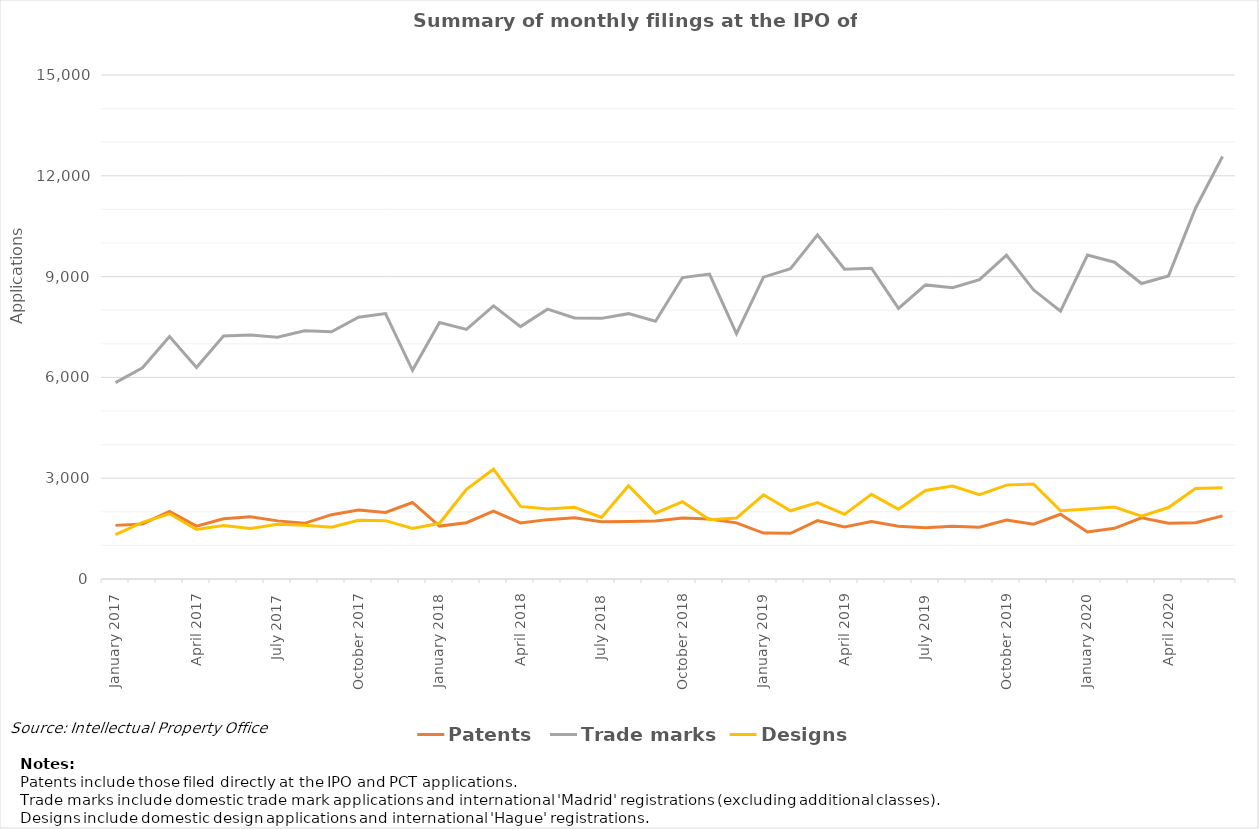
| Category | Patents | Trade marks | Designs |
|---|---|---|---|
| January 2017 | 1596 | 5843 | 1318 |
| February 2017 | 1640 | 6288 | 1687 |
| March 2017 | 2011 | 7214 | 1940 |
| April 2017 | 1573 | 6297 | 1474 |
| May 2017 | 1790 | 7234 | 1592 |
| June 2017 | 1853 | 7263 | 1502 |
| July 2017 | 1730 | 7197 | 1627 |
| August 2017 | 1657 | 7389 | 1600 |
| September 2017 | 1915 | 7359 | 1544 |
| October 2017 | 2055 | 7792 | 1745 |
| November 2017 | 1983 | 7901 | 1736 |
| December 2017 | 2277 | 6211 | 1507 |
| January 2018 | 1575 | 7634 | 1658 |
| February 2018 | 1676 | 7428 | 2672 |
| March 2018 | 2022 | 8127 | 3267 |
| April 2018 | 1670 | 7512 | 2160 |
| May 2018 | 1767 | 8030 | 2083 |
| June 2018 | 1821 | 7769 | 2136 |
| July 2018 | 1704 | 7757 | 1832 |
| August 2018 | 1713 | 7897 | 2777 |
| September 2018 | 1725 | 7673 | 1960 |
| October 2018 | 1818 | 8972 | 2302 |
| November 2018 | 1787 | 9076 | 1765 |
| December 2018 | 1670 | 7304 | 1815 |
| January 2019 | 1367 | 8983 | 2505 |
| February 2019 | 1361 | 9234 | 2031 |
| March 2019 | 1737 | 10244 | 2275 |
| April 2019 | 1552 | 9219 | 1923 |
| May 2019 | 1710 | 9251 | 2520 |
| June 2019 | 1570 | 8053 | 2074 |
| July 2019 | 1527 | 8752 | 2634 |
| August 2019 | 1572 | 8670 | 2768 |
| September 2019 | 1540 | 8907 | 2511 |
| October 2019 | 1755 | 9636 | 2794 |
| November 2019 | 1629 | 8607 | 2827 |
| December 2019 | 1927 | 7970 | 2034 |
| January 2020 | 1400 | 9642 | 2082 |
| February 2020 | 1509 | 9428 | 2143 |
| March 2020 | 1820 | 8794 | 1871 |
| April 2020 | 1658 | 9021 | 2127 |
| May 2020 | 1677 | 11035 | 2691 |
| June 2020 | 1879 | 12576 | 2719 |